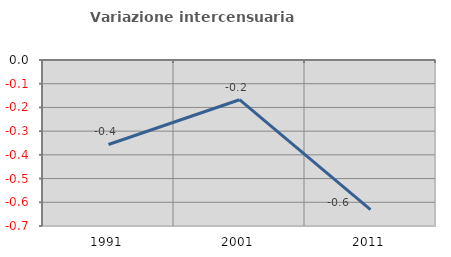
| Category | Variazione intercensuaria annua |
|---|---|
| 1991.0 | -0.356 |
| 2001.0 | -0.167 |
| 2011.0 | -0.631 |